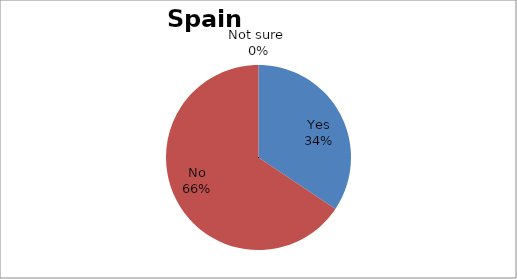
| Category | Series 0 |
|---|---|
| Yes | 11 |
| No | 21 |
| Not sure  | 0 |